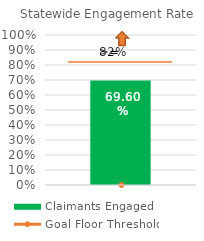
| Category | Claimants Engaged |
|---|---|
| 0 | 0.696 |